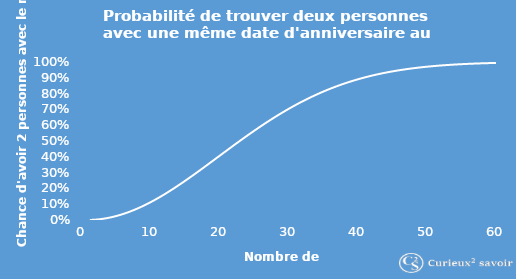
| Category | Series 1 |
|---|---|
| 1.0 | 0 |
| 2.0 | 0.003 |
| 3.0 | 0.008 |
| 4.0 | 0.016 |
| 5.0 | 0.027 |
| 6.0 | 0.04 |
| 7.0 | 0.056 |
| 8.0 | 0.074 |
| 9.0 | 0.095 |
| 10.0 | 0.117 |
| 11.0 | 0.141 |
| 12.0 | 0.167 |
| 13.0 | 0.194 |
| 14.0 | 0.223 |
| 15.0 | 0.253 |
| 16.0 | 0.284 |
| 17.0 | 0.315 |
| 18.0 | 0.347 |
| 19.0 | 0.379 |
| 20.0 | 0.411 |
| 21.0 | 0.444 |
| 22.0 | 0.476 |
| 23.0 | 0.507 |
| 24.0 | 0.538 |
| 25.0 | 0.569 |
| 26.0 | 0.598 |
| 27.0 | 0.627 |
| 28.0 | 0.654 |
| 29.0 | 0.681 |
| 30.0 | 0.706 |
| 31.0 | 0.73 |
| 32.0 | 0.753 |
| 33.0 | 0.775 |
| 34.0 | 0.795 |
| 35.0 | 0.814 |
| 36.0 | 0.832 |
| 37.0 | 0.849 |
| 38.0 | 0.864 |
| 39.0 | 0.878 |
| 40.0 | 0.891 |
| 41.0 | 0.903 |
| 42.0 | 0.914 |
| 43.0 | 0.924 |
| 44.0 | 0.933 |
| 45.0 | 0.941 |
| 46.0 | 0.948 |
| 47.0 | 0.955 |
| 48.0 | 0.961 |
| 49.0 | 0.966 |
| 50.0 | 0.97 |
| 51.0 | 0.974 |
| 52.0 | 0.978 |
| 53.0 | 0.981 |
| 54.0 | 0.984 |
| 55.0 | 0.986 |
| 56.0 | 0.988 |
| 57.0 | 0.99 |
| 58.0 | 0.992 |
| 59.0 | 0.993 |
| 60.0 | 0.994 |
| 61.0 | 0.995 |
| 62.0 | 0.996 |
| 63.0 | 0.997 |
| 64.0 | 0.997 |
| 65.0 | 0.998 |
| 66.0 | 0.998 |
| 67.0 | 0.998 |
| 68.0 | 0.999 |
| 69.0 | 0.999 |
| 70.0 | 0.999 |
| 71.0 | 0.999 |
| 72.0 | 0.999 |
| 73.0 | 1 |
| 74.0 | 1 |
| 75.0 | 1 |
| 76.0 | 1 |
| 77.0 | 1 |
| 78.0 | 1 |
| 79.0 | 1 |
| 80.0 | 1 |